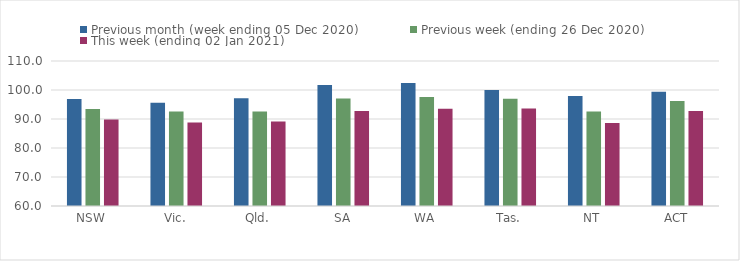
| Category | Previous month (week ending 05 Dec 2020) | Previous week (ending 26 Dec 2020) | This week (ending 02 Jan 2021) |
|---|---|---|---|
| NSW | 96.92 | 93.43 | 89.84 |
| Vic. | 95.59 | 92.56 | 88.83 |
| Qld. | 97.19 | 92.62 | 89.13 |
| SA | 101.74 | 97.06 | 92.76 |
| WA | 102.38 | 97.59 | 93.56 |
| Tas. | 99.96 | 96.94 | 93.6 |
| NT | 97.91 | 92.57 | 88.59 |
| ACT | 99.36 | 96.23 | 92.74 |